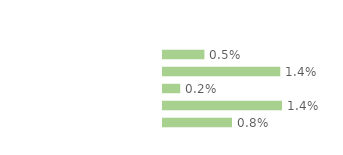
| Category | Series 0 |
|---|---|
| Personnes en emploi¹ | 0.005 |
| Chômeuses | 0.014 |
| Retraitées | 0.002 |
| Étudiantes, élèves | 0.014 |
| Autres inactifs  | 0.008 |